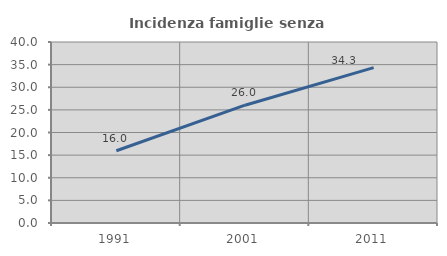
| Category | Incidenza famiglie senza nuclei |
|---|---|
| 1991.0 | 15.974 |
| 2001.0 | 26.034 |
| 2011.0 | 34.325 |